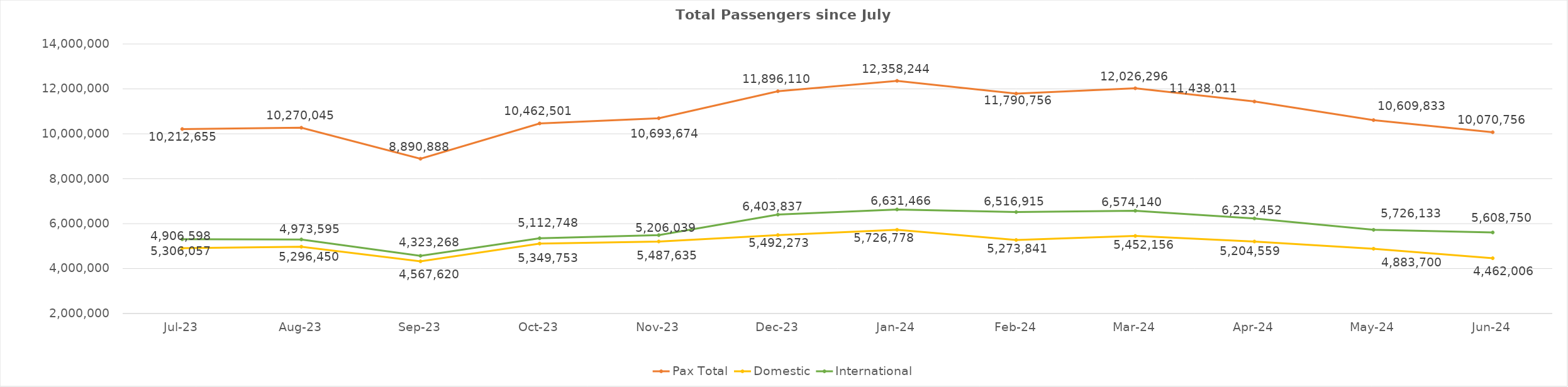
| Category | Pax Total | Domestic | International |
|---|---|---|---|
| 2023-07-01 | 10212655 | 4906598 | 5306057 |
| 2023-08-01 | 10270045 | 4973595 | 5296450 |
| 2023-09-01 | 8890888 | 4323268 | 4567620 |
| 2023-10-01 | 10462501 | 5112748 | 5349753 |
| 2023-11-01 | 10693674 | 5206039 | 5487635 |
| 2023-12-01 | 11896110 | 5492273 | 6403837 |
| 2024-01-01 | 12358244 | 5726778 | 6631466 |
| 2024-02-01 | 11790756 | 5273841 | 6516915 |
| 2024-03-01 | 12026296 | 5452156 | 6574140 |
| 2024-04-01 | 11438011 | 5204559 | 6233452 |
| 2024-05-01 | 10609833 | 4883700 | 5726133 |
| 2024-06-02 | 10070756 | 4462006 | 5608750 |